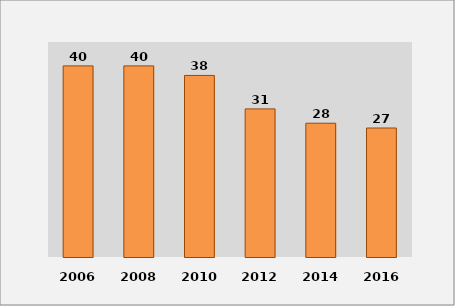
| Category | Series 1 |
|---|---|
| 2006.0 | 40 |
| 2008.0 | 40 |
| 2010.0 | 38 |
| 2012.0 | 31 |
| 2014.0 | 28 |
| 2016.0 | 27 |